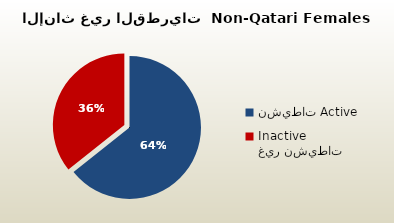
| Category | الاناث غير القطريات  Non-Qatari Females |
|---|---|
| نشيطات Active | 253295 |
| غير نشيطات Inactive | 140584 |